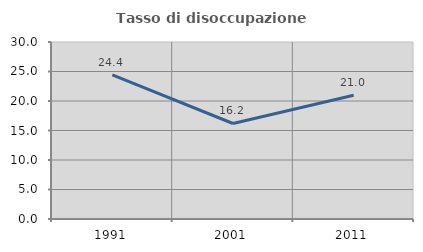
| Category | Tasso di disoccupazione giovanile  |
|---|---|
| 1991.0 | 24.444 |
| 2001.0 | 16.187 |
| 2011.0 | 20.988 |